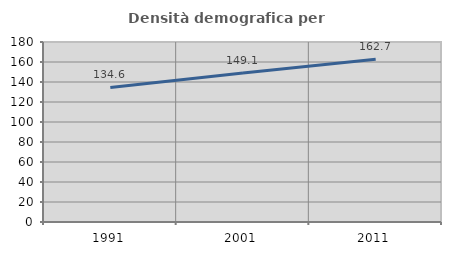
| Category | Densità demografica |
|---|---|
| 1991.0 | 134.583 |
| 2001.0 | 149.096 |
| 2011.0 | 162.67 |